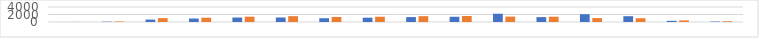
| Category | Series 0 | Series 1 |
|---|---|---|
| 7:00-8:00 | 16 | 32 |
| 8:00-9:00 | 88 | 136 |
| 9:00-10:00 | 648 | 1024 |
| 10:00-11:00 | 924 | 1144 |
| 11:00-12:00 | 1192 | 1420 |
| 12:00-13:00 | 1204 | 1556 |
| 13:00-14:00 | 1004 | 1344 |
| 14:00-15:00 | 1148 | 1404 |
| 15:00-16:00 | 1312 | 1556 |
| 16:00-17:00 | 1396 | 1608 |
| 17:00-18:00 | 2204 | 1444 |
| 18:00-19:00 | 1300 | 1408 |
| 19:00-20:00 | 2084 | 1044 |
| 20:00-21:00 | 1548 | 996 |
| 21:00-22:00 | 316 | 424 |
| 22:00-23:00 | 116 | 196 |